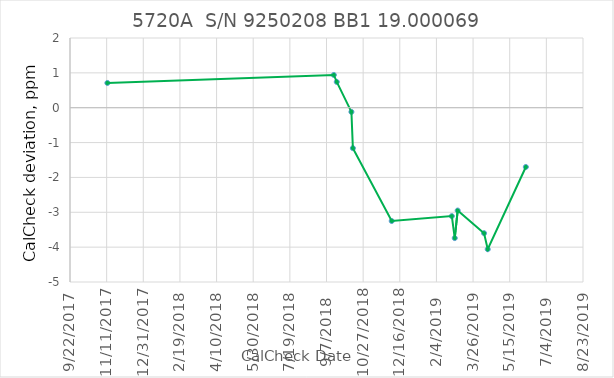
| Category | 19.000069 |
|---|---|
| 43051.0 | 0.71 |
| 43360.0 | 0.94 |
| 43364.0 | 0.74 |
| 43384.0 | -0.12 |
| 43386.0 | -1.16 |
| 43439.0 | -3.25 |
| 43521.0 | -3.11 |
| 43525.0 | -3.74 |
| 43529.0 | -2.95 |
| 43565.0 | -3.6 |
| 43570.0 | -4.06 |
| 43622.0 | -1.7 |